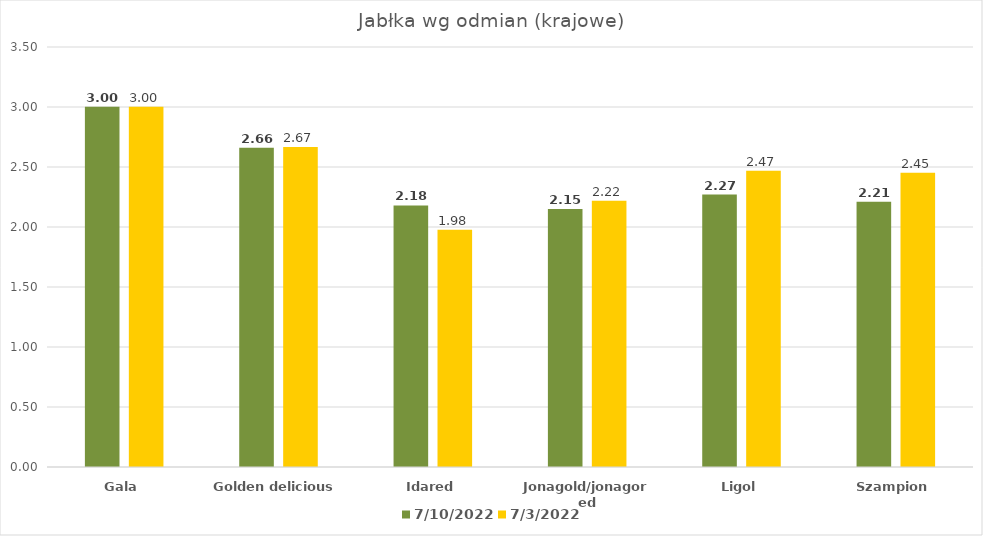
| Category | 2022-07-10 | 2022-07-03 |
|---|---|---|
| Gala | 3.002 | 3.002 |
| Golden delicious | 2.66 | 2.667 |
| Idared | 2.18 | 1.976 |
| Jonagold/jonagored | 2.15 | 2.218 |
| Ligol | 2.27 | 2.469 |
| Szampion | 2.21 | 2.452 |